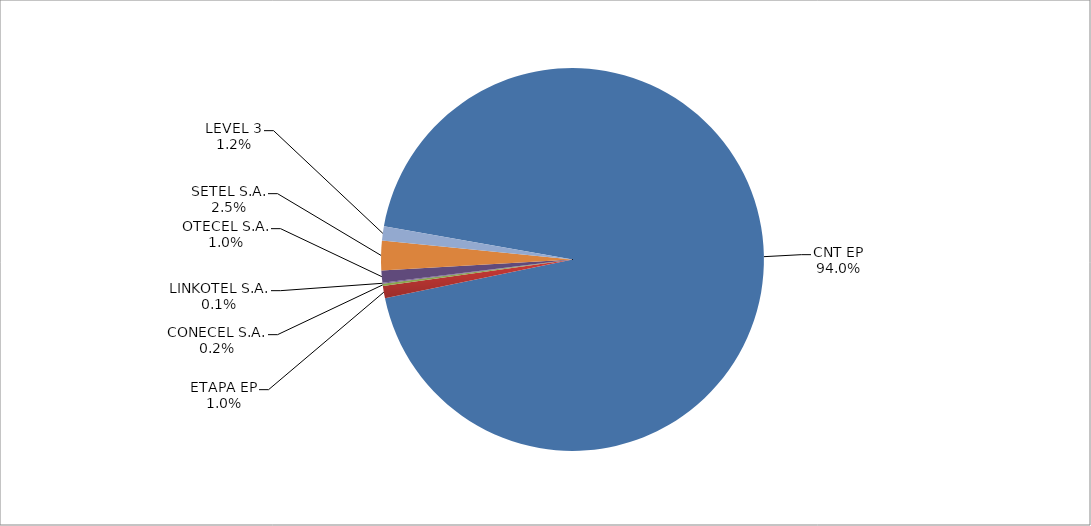
| Category | Series 0 |
|---|---|
| CNT EP | 2448 |
| ETAPA EP | 27 |
| CONECEL S.A. | 5 |
| LINKOTEL S.A. | 2 |
| OTECEL S.A. | 27 |
| SETEL S.A. | 65 |
| LEVEL 3 | 31 |